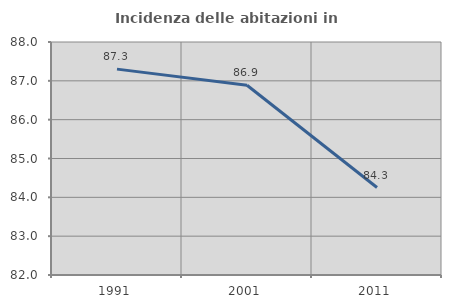
| Category | Incidenza delle abitazioni in proprietà  |
|---|---|
| 1991.0 | 87.302 |
| 2001.0 | 86.885 |
| 2011.0 | 84.252 |